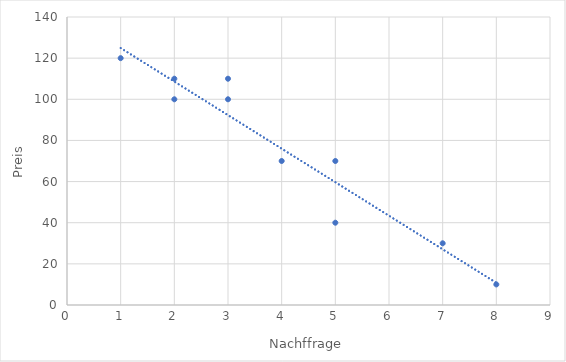
| Category | Series 0 |
|---|---|
| 3.0 | 100 |
| 2.0 | 110 |
| 4.0 | 70 |
| 5.0 | 70 |
| 8.0 | 10 |
| 7.0 | 30 |
| 5.0 | 40 |
| 3.0 | 110 |
| 2.0 | 100 |
| 1.0 | 120 |